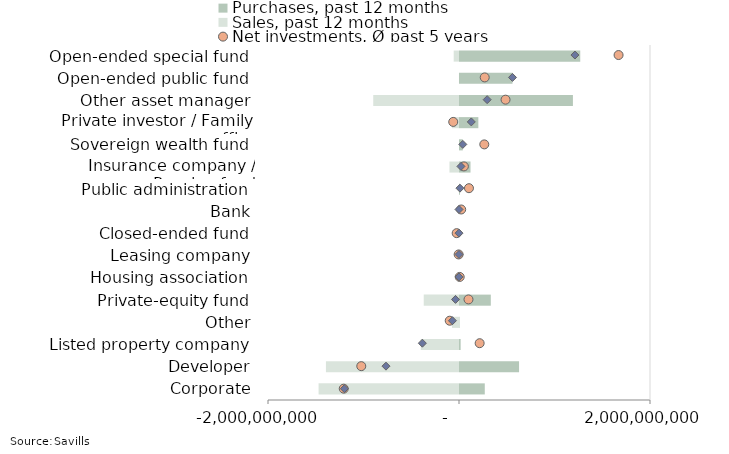
| Category | Purchases, past 12 months | Sales, past 12 months |
|---|---|---|
| Corporate | 269985667.98 | -1470373470.97 |
| Developer | 628855618.49 | -1393361447.97 |
| Listed property company | 17200000 | -400750400 |
| Other | 4999999 | -73875278 |
| Private-equity fund | 333029599 | -369408029.97 |
| Housing association | 0 | 0 |
| Leasing company | 0 | 0 |
| Closed-ended fund | 0 | 0 |
| Bank | 0 | 0 |
| Public administration | 10104746 | -132000 |
| Insurance company / Pension fund | 120376000 | -100000000 |
| Sovereign wealth fund | 40000000 | 0 |
| Private investor / Family office | 202566128.5 | -73752719 |
| Other asset manager | 1192929308.95 | -897999879.98 |
| Open-ended public fund | 559999999.97 | 0 |
| Open-ended special fund | 1269534320 | -55649500 |